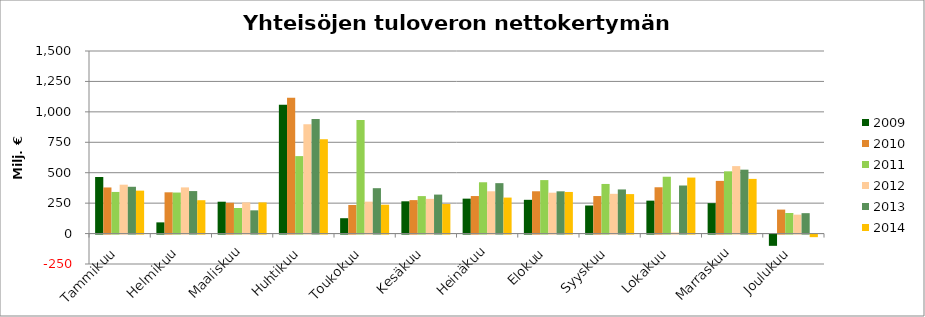
| Category | 2009 | 2010 | 2011 | 2012 | 2013 | 2014 |
|---|---|---|---|---|---|---|
| Tammikuu | 464.899 | 378.86 | 341.987 | 401.627 | 384.485 | 352.772 |
| Helmikuu | 92.021 | 339.045 | 337.078 | 379.401 | 349.199 | 274.106 |
| Maaliskuu | 261.783 | 253.057 | 210.203 | 256.28 | 190.945 | 256.156 |
| Huhtikuu | 1059.201 | 1115.624 | 636.437 | 897.203 | 940.935 | 774.228 |
| Toukokuu | 126.163 | 234.756 | 933.434 | 262.244 | 372.901 | 237.146 |
| Kesäkuu | 265.105 | 274.88 | 307.856 | 285.13 | 320.319 | 242.945 |
| Heinäkuu | 286.978 | 308.391 | 421.522 | 347.389 | 414.27 | 295.737 |
| Elokuu | 277.363 | 347.548 | 439.399 | 335.795 | 347.137 | 341.844 |
| Syyskuu | 230.468 | 308.333 | 407.65 | 326.578 | 362.569 | 324.323 |
| Lokakuu | 270.56 | 380.508 | 466.894 | 9.04 | 394.905 | 460.197 |
| Marraskuu | 249.968 | 432.891 | 511.438 | 554.296 | 524.993 | 449.175 |
| Joulukuu | -92.536 | 196.924 | 169.141 | 155.44 | 167.693 | -21.214 |